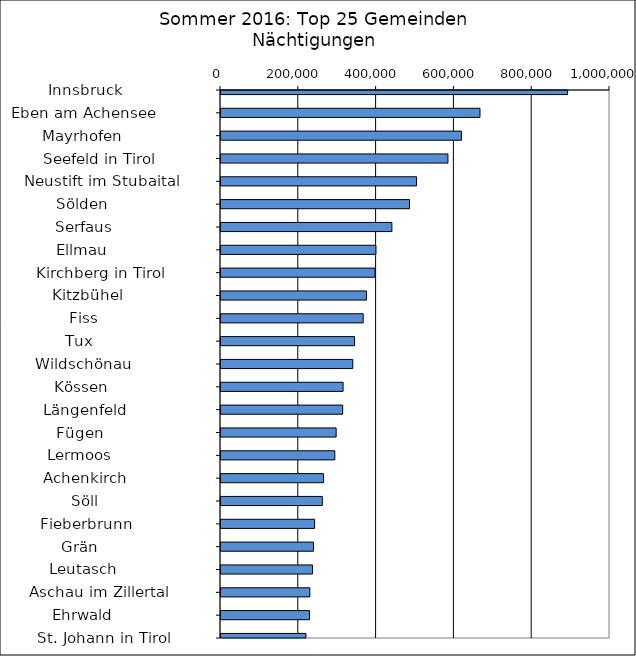
| Category | Series 0 |
|---|---|
|   Innsbruck                  | 890975 |
|   Eben am Achensee           | 665829 |
|   Mayrhofen                  | 618054 |
|   Seefeld in Tirol           | 583413 |
|   Neustift im Stubaital      | 502576 |
|   Sölden                     | 484615 |
|   Serfaus                    | 439317 |
|   Ellmau                     | 398305 |
|   Kirchberg in Tirol         | 395971 |
|   Kitzbühel                  | 373718 |
|   Fiss                       | 365536 |
|   Tux                        | 343245 |
|   Wildschönau                | 338757 |
|   Kössen                     | 313826 |
|   Längenfeld                 | 312800 |
|   Fügen                      | 295997 |
|   Lermoos                    | 292596 |
|   Achenkirch                 | 263658 |
|   Söll                       | 260477 |
|   Fieberbrunn                | 240694 |
|   Grän                       | 237737 |
|   Leutasch                   | 235102 |
|   Aschau im Zillertal        | 228372 |
|   Ehrwald                    | 227636 |
|   St. Johann in Tirol        | 218440 |